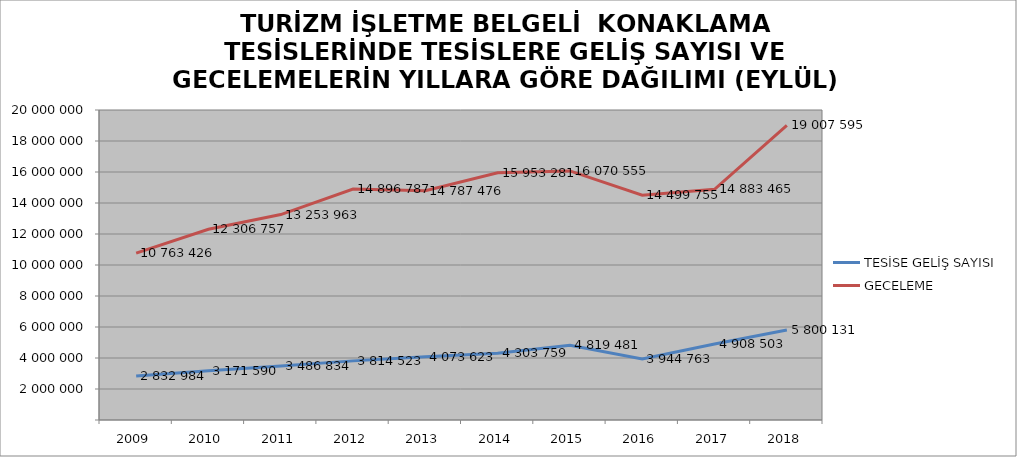
| Category | TESİSE GELİŞ SAYISI | GECELEME |
|---|---|---|
| 2009 | 2832984 | 10763426 |
| 2010 | 3171590 | 12306757 |
| 2011 | 3486834 | 13253963 |
| 2012 | 3814523 | 14896787 |
| 2013 | 4073623 | 14787476 |
| 2014 | 4303759 | 15953281 |
| 2015 | 4819481 | 16070555 |
| 2016 | 3944763 | 14499755 |
| 2017 | 4908503 | 14883465 |
| 2018 | 5800131 | 19007595 |